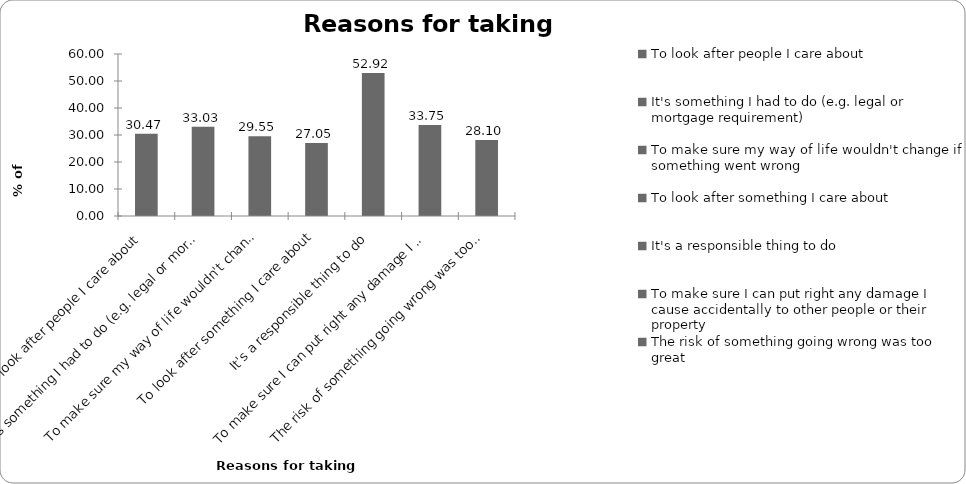
| Category | Reasons for taking insurance |
|---|---|
| To look after people I care about | 30.466 |
| It's something I had to do (e.g. legal or mortgage requirement) | 33.027 |
| To make sure my way of life wouldn't change if something went wrong | 29.547 |
| To look after something I care about | 27.052 |
| It's a responsible thing to do | 52.922 |
| To make sure I can put right any damage I cause accidentally to other people or their property | 33.749 |
| The risk of something going wrong was too great | 28.102 |